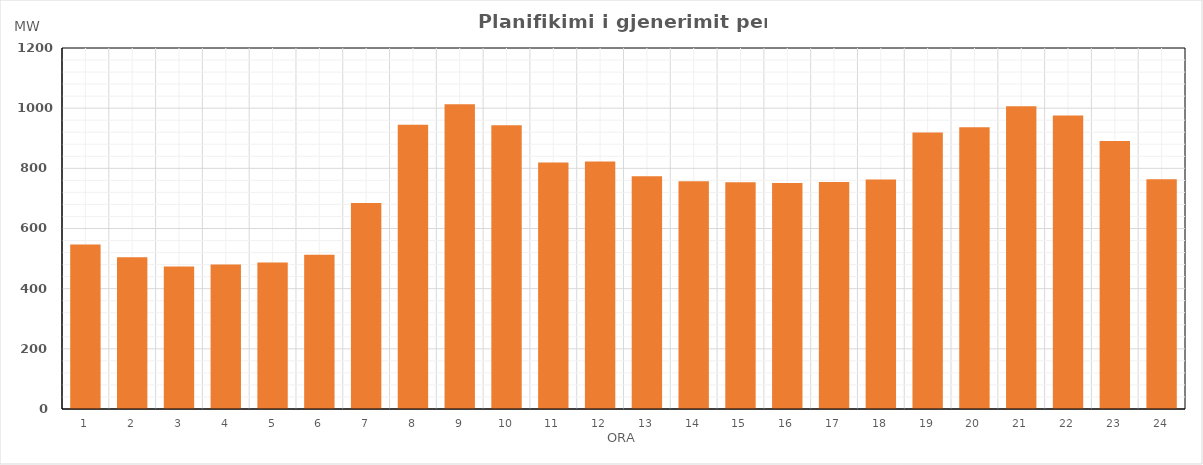
| Category | Max (MW) |
|---|---|
| 0 | 546.44 |
| 1 | 504.54 |
| 2 | 473.73 |
| 3 | 480.42 |
| 4 | 487.12 |
| 5 | 512.78 |
| 6 | 684.77 |
| 7 | 944.88 |
| 8 | 1012.78 |
| 9 | 942.86 |
| 10 | 819.78 |
| 11 | 822.54 |
| 12 | 773.56 |
| 13 | 756.68 |
| 14 | 753.68 |
| 15 | 751.36 |
| 16 | 754.25 |
| 17 | 762.94 |
| 18 | 918.83 |
| 19 | 936.94 |
| 20 | 1006.21 |
| 21 | 976.01 |
| 22 | 891.11 |
| 23 | 763.4 |